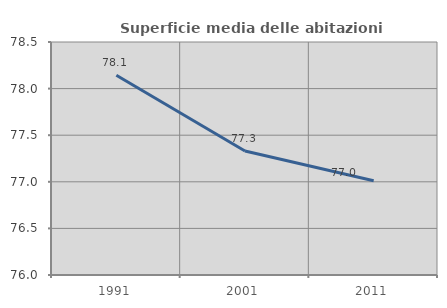
| Category | Superficie media delle abitazioni occupate |
|---|---|
| 1991.0 | 78.144 |
| 2001.0 | 77.33 |
| 2011.0 | 77.011 |